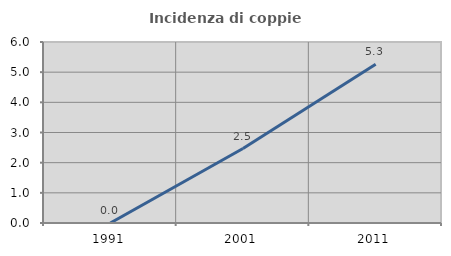
| Category | Incidenza di coppie miste |
|---|---|
| 1991.0 | 0 |
| 2001.0 | 2.469 |
| 2011.0 | 5.263 |